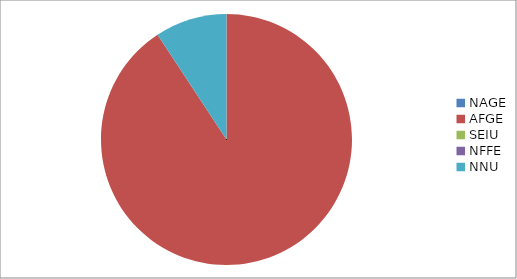
| Category | Series 0 |
|---|---|
| NAGE | 0 |
| AFGE | 9181 |
| SEIU | 0 |
| NFFE | 0 |
| NNU | 937 |